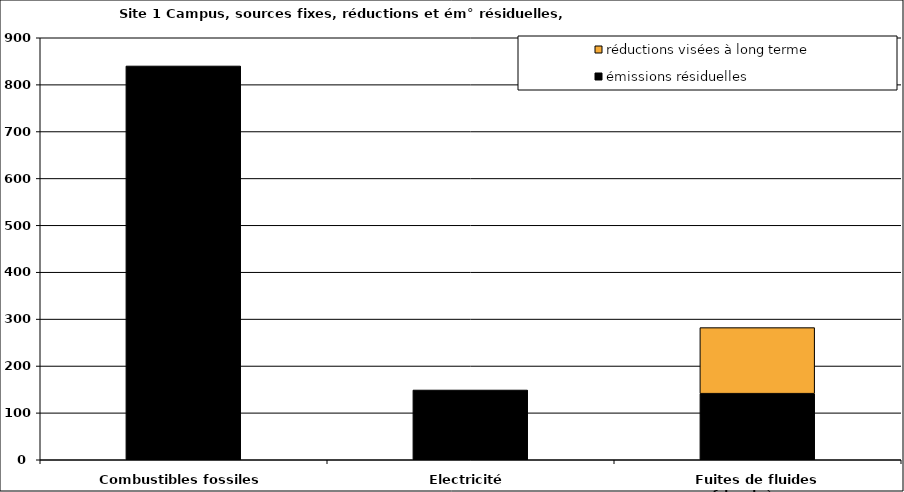
| Category | émissions résiduelles | réductions visées à long terme |
|---|---|---|
| Combustibles fossiles | 839.857 | 0 |
| Electricité | 148.816 | 0 |
| Fuites de fluides frigorigènes | 140.94 | 140.94 |